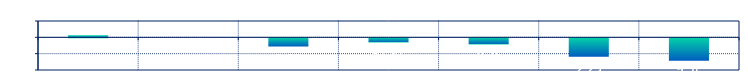
| Category | Series 0 |
|---|---|
| 0 | 0.25 |
| 1 | 0 |
| 2 | -1 |
| 3 | -0.5 |
| 4 | -0.75 |
| 5 | -2.25 |
| 6 | -2.75 |